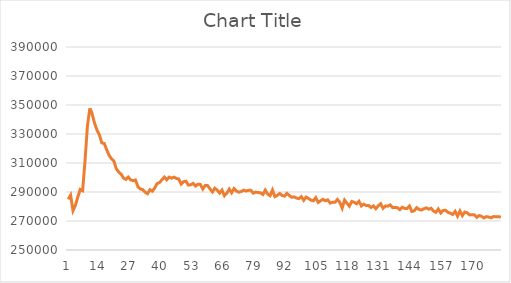
| Category | Series 0 |
|---|---|
| 0 | 284977.992 |
| 1 | 287792.805 |
| 2 | 277126.597 |
| 3 | 280753.943 |
| 4 | 286601.227 |
| 5 | 291750.511 |
| 6 | 290875.983 |
| 7 | 311482.059 |
| 8 | 335657.476 |
| 9 | 347653.617 |
| 10 | 343500.184 |
| 11 | 337210.414 |
| 12 | 332639.81 |
| 13 | 329302.056 |
| 14 | 323841.604 |
| 15 | 323486.046 |
| 16 | 319197.131 |
| 17 | 315354.57 |
| 18 | 312892.06 |
| 19 | 311252.359 |
| 20 | 306113.003 |
| 21 | 303762.49 |
| 22 | 302299.599 |
| 23 | 299637.701 |
| 24 | 298691.235 |
| 25 | 300308.754 |
| 26 | 298337.536 |
| 27 | 297816.015 |
| 28 | 298281.66 |
| 29 | 293732.953 |
| 30 | 292094.669 |
| 31 | 291632.864 |
| 32 | 289888.919 |
| 33 | 288840.76 |
| 34 | 291617.034 |
| 35 | 290551.763 |
| 36 | 292754.821 |
| 37 | 295849.864 |
| 38 | 296502.818 |
| 39 | 298410.582 |
| 40 | 300290.873 |
| 41 | 298447.01 |
| 42 | 300248.02 |
| 43 | 299555.051 |
| 44 | 300258.633 |
| 45 | 299351.951 |
| 46 | 298978.518 |
| 47 | 295481.185 |
| 48 | 297127.575 |
| 49 | 297475.699 |
| 50 | 294767.873 |
| 51 | 294988.804 |
| 52 | 295939.252 |
| 53 | 294095.96 |
| 54 | 295363.024 |
| 55 | 295210.38 |
| 56 | 292092.137 |
| 57 | 294549.59 |
| 58 | 294425.864 |
| 59 | 292190.647 |
| 60 | 290049.282 |
| 61 | 292607.806 |
| 62 | 291316.7 |
| 63 | 289265.789 |
| 64 | 291298.494 |
| 65 | 287442.348 |
| 66 | 289199.74 |
| 67 | 292016.043 |
| 68 | 289457.798 |
| 69 | 292397.775 |
| 70 | 290629.466 |
| 71 | 289887.413 |
| 72 | 290346.628 |
| 73 | 291270.337 |
| 74 | 290638.208 |
| 75 | 291132.901 |
| 76 | 291200.422 |
| 77 | 289179.634 |
| 78 | 289950.842 |
| 79 | 289623.159 |
| 80 | 289470.143 |
| 81 | 288262.383 |
| 82 | 291328.357 |
| 83 | 288600.65 |
| 84 | 287426.805 |
| 85 | 291358.424 |
| 86 | 286790.582 |
| 87 | 287677.505 |
| 88 | 288939.008 |
| 89 | 287617.999 |
| 90 | 287145.001 |
| 91 | 289074.441 |
| 92 | 287574.338 |
| 93 | 286356.453 |
| 94 | 286666.036 |
| 95 | 285804.889 |
| 96 | 285424.322 |
| 97 | 286811.939 |
| 98 | 284263.95 |
| 99 | 286511.129 |
| 100 | 285557.955 |
| 101 | 284378.516 |
| 102 | 283944.028 |
| 103 | 286097.746 |
| 104 | 282825.279 |
| 105 | 283925.201 |
| 106 | 284995.449 |
| 107 | 283956.923 |
| 108 | 284595.409 |
| 109 | 282375.296 |
| 110 | 282922.238 |
| 111 | 282883.178 |
| 112 | 284871.462 |
| 113 | 282916.894 |
| 114 | 278893.043 |
| 115 | 284412.414 |
| 116 | 282203.526 |
| 117 | 280182.68 |
| 118 | 283490.555 |
| 119 | 282937.914 |
| 120 | 281864.049 |
| 121 | 283611.424 |
| 122 | 280366.479 |
| 123 | 281600.116 |
| 124 | 280660.662 |
| 125 | 280745.927 |
| 126 | 279313.258 |
| 127 | 280379.452 |
| 128 | 278470.91 |
| 129 | 280486.21 |
| 130 | 281931.917 |
| 131 | 278780.634 |
| 132 | 280278.711 |
| 133 | 280250.603 |
| 134 | 281094.288 |
| 135 | 279211.696 |
| 136 | 279411.896 |
| 137 | 279154.336 |
| 138 | 277834.871 |
| 139 | 279475.936 |
| 140 | 278669.654 |
| 141 | 278610.632 |
| 142 | 280351.586 |
| 143 | 276580.79 |
| 144 | 277076.14 |
| 145 | 279202.004 |
| 146 | 277925.664 |
| 147 | 277551.335 |
| 148 | 278481.822 |
| 149 | 279041.036 |
| 150 | 278137.398 |
| 151 | 278777.272 |
| 152 | 276900.261 |
| 153 | 276024.558 |
| 154 | 278317.98 |
| 155 | 275553.63 |
| 156 | 277267.766 |
| 157 | 277383.6 |
| 158 | 275987.841 |
| 159 | 275382.099 |
| 160 | 274518.995 |
| 161 | 276658.515 |
| 162 | 273319.935 |
| 163 | 276917.881 |
| 164 | 273711.967 |
| 165 | 276167.432 |
| 166 | 275687.435 |
| 167 | 274214.344 |
| 168 | 274327.015 |
| 169 | 274228.723 |
| 170 | 272486.028 |
| 171 | 273781.186 |
| 172 | 273202.036 |
| 173 | 272108.906 |
| 174 | 273024.879 |
| 175 | 272697.04 |
| 176 | 272160.28 |
| 177 | 273120.911 |
| 178 | 272907.508 |
| 179 | 273020.345 |
| 180 | 272620.315 |